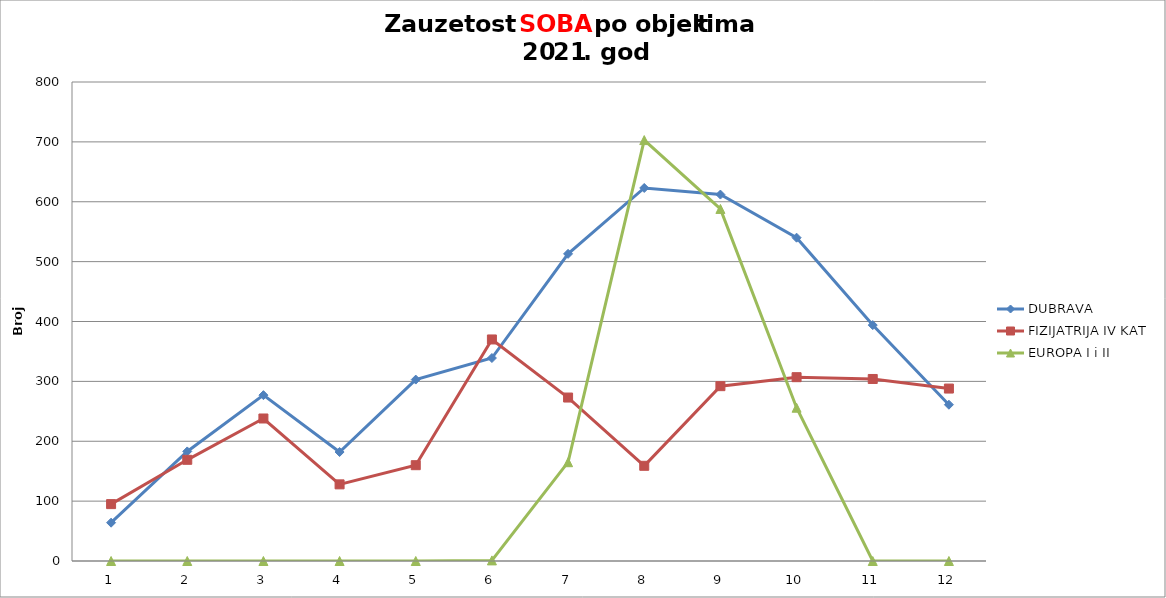
| Category | DUBRAVA | FIZIJATRIJA IV KAT | EUROPA I i II  |
|---|---|---|---|
| 0 | 64 | 95 | 0 |
| 1 | 183 | 169 | 0 |
| 2 | 277 | 238 | 0 |
| 3 | 182 | 128 | 0 |
| 4 | 303 | 160 | 0 |
| 5 | 339 | 370 | 1 |
| 6 | 513 | 273 | 165 |
| 7 | 623 | 159 | 703 |
| 8 | 612 | 292 | 588 |
| 9 | 540 | 307 | 256 |
| 10 | 394 | 304 | 0 |
| 11 | 261 | 288 | 0 |